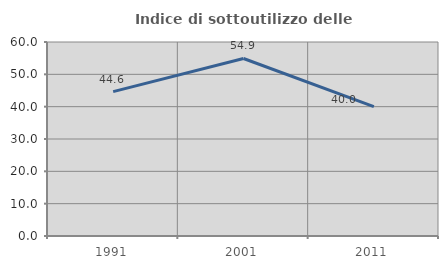
| Category | Indice di sottoutilizzo delle abitazioni  |
|---|---|
| 1991.0 | 44.643 |
| 2001.0 | 54.902 |
| 2011.0 | 40 |